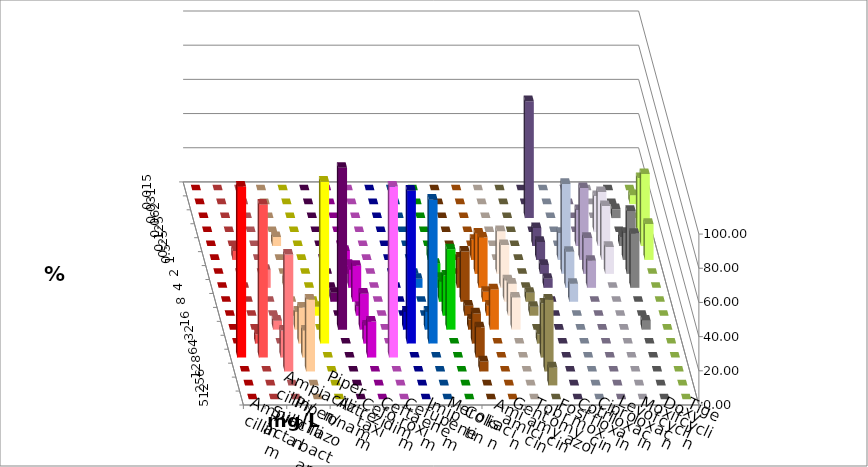
| Category | Ampicillin | Ampicillin/ Sulbactam | Piperacillin | Piperacillin/ Tazobactam | Aztreonam | Cefotaxim | Ceftazidim | Cefuroxim | Imipenem | Meropenem | Colistin | Amikacin | Gentamicin | Tobramycin | Fosfomycin | Cotrimoxazol | Ciprofloxacin | Levofloxacin | Moxifloxacin | Doxycyclin | Tigecyclin |
|---|---|---|---|---|---|---|---|---|---|---|---|---|---|---|---|---|---|---|---|---|---|
| 0.015 | 0 | 0 | 0 | 0 | 0 | 0 | 0 | 0 | 0 | 0 | 0 | 0 | 0 | 0 | 0 | 0 | 0 | 0 | 0 | 0 | 0 |
| 0.031 | 0 | 0 | 0 | 0 | 0 | 0 | 0 | 0 | 0 | 0 | 0 | 0 | 0 | 0 | 0 | 0 | 0 | 0 | 0 | 0 | 5.263 |
| 0.062 | 0 | 0 | 0 | 0 | 0 | 0 | 0 | 0 | 0 | 0 | 0 | 0 | 0 | 0 | 0 | 68.421 | 0 | 0 | 0 | 5.263 | 0 |
| 0.125 | 0 | 0 | 0 | 0 | 0 | 0 | 0 | 0 | 0 | 0 | 0 | 0 | 0 | 0 | 0 | 0 | 0 | 0 | 21.053 | 0 | 31.579 |
| 0.25 | 0 | 0 | 0 | 5.263 | 0 | 0 | 0 | 0 | 0 | 0 | 0 | 0 | 0 | 0 | 0 | 10.526 | 0 | 21.053 | 31.579 | 5.263 | 42.105 |
| 0.5 | 0 | 5.263 | 0 | 0 | 0 | 0 | 5.263 | 0 | 0 | 0 | 5.882 | 0 | 11.765 | 0 | 0 | 10.526 | 15.789 | 42.105 | 31.579 | 15.789 | 21.053 |
| 1.0 | 0 | 0 | 0 | 0 | 0 | 0 | 5.263 | 0 | 0 | 0 | 5.882 | 0 | 23.529 | 25 | 0 | 5.263 | 52.632 | 21.053 | 15.789 | 36.842 | 0 |
| 2.0 | 0 | 0 | 10.526 | 5.263 | 0 | 0 | 10.526 | 0 | 0 | 5.263 | 5.882 | 17.647 | 29.412 | 25 | 0 | 5.263 | 21.053 | 15.789 | 0 | 31.579 | 0 |
| 4.0 | 0 | 0 | 0 | 0 | 0 | 5.263 | 21.053 | 0 | 0 | 0 | 11.765 | 29.412 | 5.882 | 12.5 | 5.263 | 0 | 10.526 | 0 | 0 | 0 | 0 |
| 8.0 | 0 | 0 | 0 | 0 | 5.263 | 0 | 5.263 | 0 | 0 | 0 | 23.529 | 5.882 | 5.882 | 18.75 | 5.263 | 0 | 0 | 0 | 0 | 0 | 0 |
| 16.0 | 0 | 0 | 5.263 | 10.526 | 0 | 94.737 | 21.053 | 0 | 10.526 | 10.526 | 47.059 | 5.882 | 23.529 | 18.75 | 0 | 0 | 0 | 0 | 0 | 5.263 | 0 |
| 32.0 | 0 | 5.263 | 0 | 21.053 | 94.737 | 0 | 10.526 | 0 | 89.474 | 84.211 | 0 | 17.647 | 0 | 0 | 5.263 | 0 | 0 | 0 | 0 | 0 | 0 |
| 64.0 | 100 | 89.474 | 15.789 | 15.789 | 0 | 0 | 21.053 | 100 | 0 | 0 | 0 | 17.647 | 0 | 0 | 31.579 | 0 | 0 | 0 | 0 | 0 | 0 |
| 128.0 | 0 | 0 | 68.421 | 42.105 | 0 | 0 | 0 | 0 | 0 | 0 | 0 | 5.882 | 0 | 0 | 42.105 | 0 | 0 | 0 | 0 | 0 | 0 |
| 256.0 | 0 | 0 | 0 | 0 | 0 | 0 | 0 | 0 | 0 | 0 | 0 | 0 | 0 | 0 | 10.526 | 0 | 0 | 0 | 0 | 0 | 0 |
| 512.0 | 0 | 0 | 0 | 0 | 0 | 0 | 0 | 0 | 0 | 0 | 0 | 0 | 0 | 0 | 0 | 0 | 0 | 0 | 0 | 0 | 0 |